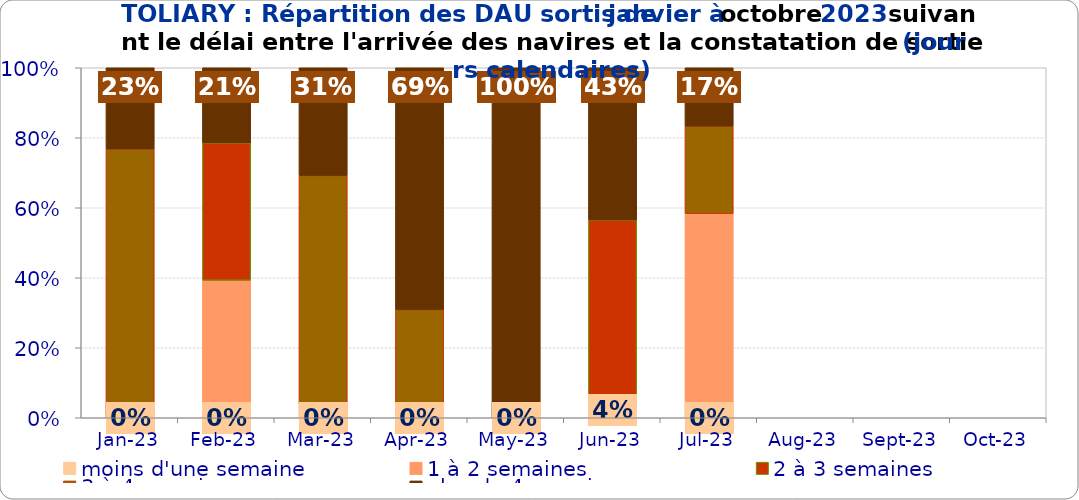
| Category | moins d'une semaine | 1 à 2 semaines | 2 à 3 semaines | 3 à 4 semaines | plus de 4 semaines |
|---|---|---|---|---|---|
| 2023-01-01 | 0 | 0 | 0 | 0.768 | 0.232 |
| 2023-02-01 | 0 | 0.393 | 0.393 | 0 | 0.214 |
| 2023-03-01 | 0 | 0.038 | 0 | 0.654 | 0.308 |
| 2023-04-01 | 0 | 0 | 0 | 0.31 | 0.69 |
| 2023-05-01 | 0 | 0 | 0 | 0 | 1 |
| 2023-06-01 | 0.043 | 0 | 0.522 | 0 | 0.435 |
| 2023-07-01 | 0 | 0.583 | 0 | 0.25 | 0.167 |
| 2023-08-01 | 0 | 0 | 0 | 0 | 0 |
| 2023-09-01 | 0 | 0 | 0 | 0 | 0 |
| 2023-10-01 | 0 | 0 | 0 | 0 | 0 |